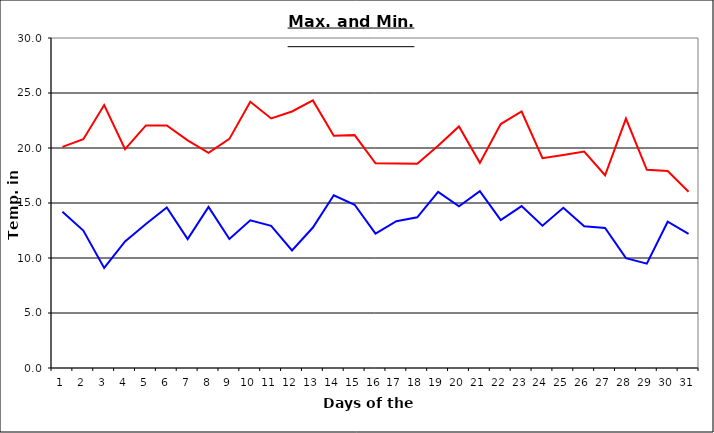
| Category | Series 0 | Series 1 |
|---|---|---|
| 0 | 20.1 | 14.21 |
| 1 | 20.8 | 12.49 |
| 2 | 23.9 | 9.1 |
| 3 | 19.9 | 11.5 |
| 4 | 22.05 | 13.1 |
| 5 | 22.05 | 14.6 |
| 6 | 20.7 | 11.72 |
| 7 | 19.56 | 14.64 |
| 8 | 20.83 | 11.72 |
| 9 | 24.2 | 13.42 |
| 10 | 22.69 | 12.92 |
| 11 | 23.32 | 10.69 |
| 12 | 24.33 | 12.77 |
| 13 | 21.12 | 15.7 |
| 14 | 21.17 | 14.84 |
| 15 | 18.61 | 12.22 |
| 16 | 18.6 | 13.35 |
| 17 | 18.56 | 13.7 |
| 18 | 20.21 | 16.01 |
| 19 | 21.96 | 14.7 |
| 20 | 18.65 | 16.07 |
| 21 | 22.18 | 13.44 |
| 22 | 23.32 | 14.72 |
| 23 | 19.08 | 12.93 |
| 24 | 19.36 | 14.57 |
| 25 | 19.67 | 12.88 |
| 26 | 17.52 | 12.73 |
| 27 | 22.67 | 9.99 |
| 28 | 18.02 | 9.49 |
| 29 | 17.91 | 13.3 |
| 30 | 16.02 | 12.2 |